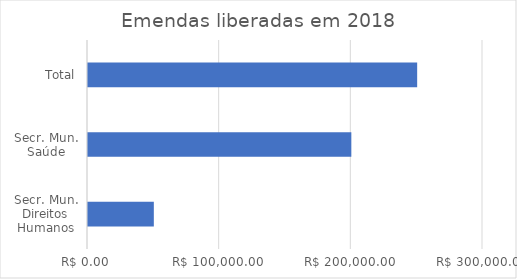
| Category | Series 0 |
|---|---|
| Secr. Mun. Direitos Humanos | 50000 |
| Secr. Mun. Saúde | 200000 |
| Total | 250000 |